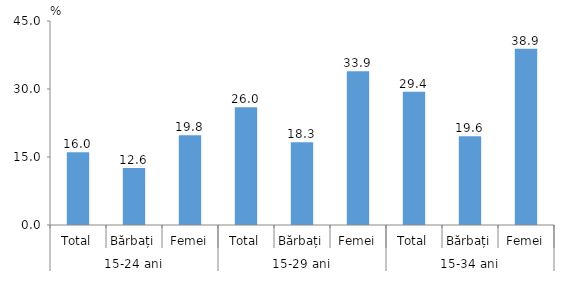
| Category | Series 0 |
|---|---|
| 0 | 16.028 |
| 1 | 12.563 |
| 2 | 19.78 |
| 3 | 25.965 |
| 4 | 18.261 |
| 5 | 33.93 |
| 6 | 29.373 |
| 7 | 19.601 |
| 8 | 38.852 |